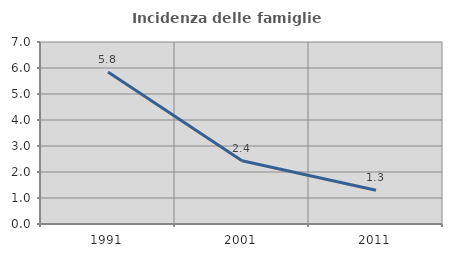
| Category | Incidenza delle famiglie numerose |
|---|---|
| 1991.0 | 5.847 |
| 2001.0 | 2.435 |
| 2011.0 | 1.298 |